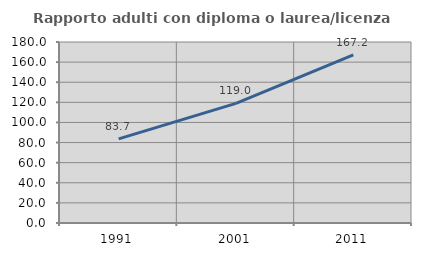
| Category | Rapporto adulti con diploma o laurea/licenza media  |
|---|---|
| 1991.0 | 83.712 |
| 2001.0 | 118.994 |
| 2011.0 | 167.245 |